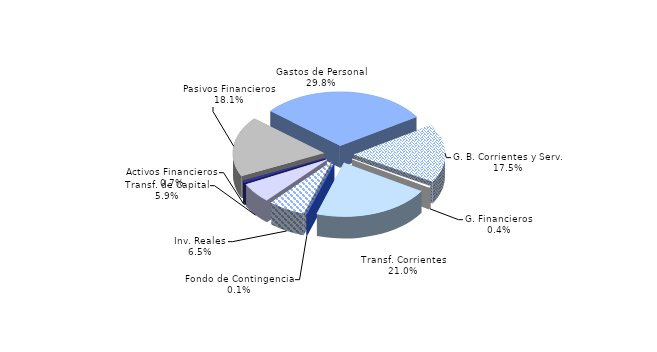
| Category | Series 0 |
|---|---|
| Gastos de Personal | 29.834 |
| G. B. Corrientes y Serv. | 17.461 |
| G. Financieros | 0.422 |
| Transf. Corrientes | 21.048 |
| Fondo de Contingencia | 0.064 |
| Inv. Reales | 6.519 |
| Transf. de Capital | 5.922 |
| Activos Financieros | 0.66 |
| Pasivos Financieros | 18.07 |